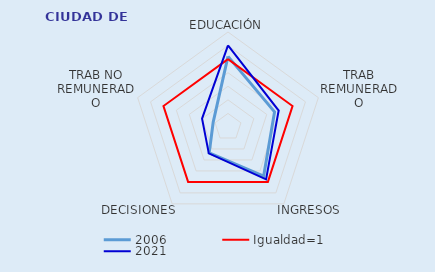
| Category | 2006 | Igualdad=1 | 2021 |
|---|---|---|---|
| EDUCACIÓN | 1.041 | 1 | 1.202 |
| TRAB REMUNERADO | 0.721 | 1 | 0.785 |
| INGRESOS | 0.894 | 1 | 0.955 |
| DECISIONES | 0.471 | 1 | 0.481 |
| TRAB NO REMUNERADO | 0.23 | 1 | 0.402 |